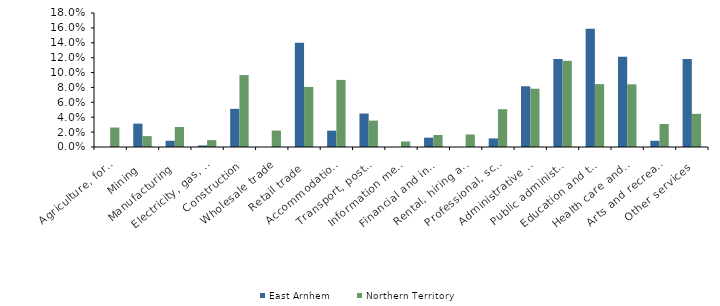
| Category | East Arnhem | Northern Territory |
|---|---|---|
| Agriculture, forestry and fishing | 0 | 0.026 |
| Mining | 0.031 | 0.015 |
| Manufacturing | 0.008 | 0.027 |
| Electricity, gas, water and waste services | 0.002 | 0.009 |
| Construction | 0.051 | 0.097 |
| Wholesale trade | 0 | 0.022 |
| Retail trade | 0.14 | 0.081 |
| Accommodation and food services | 0.022 | 0.09 |
| Transport, postal and warehousing | 0.045 | 0.035 |
| Information media and telecommunications | 0 | 0.007 |
| Financial and insurance services | 0.013 | 0.016 |
| Rental, hiring and real estate services | 0 | 0.017 |
| Professional, scientific and technical services | 0.012 | 0.051 |
| Administrative and support services | 0.082 | 0.078 |
| Public administration and safety | 0.118 | 0.116 |
| Education and training | 0.159 | 0.084 |
| Health care and social assistance | 0.121 | 0.084 |
| Arts and recreation services | 0.008 | 0.031 |
| Other services | 0.118 | 0.045 |